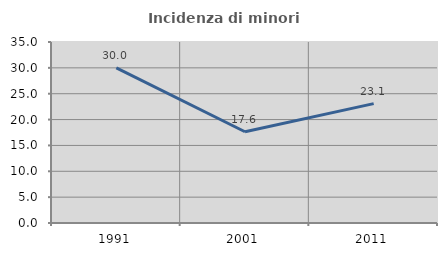
| Category | Incidenza di minori stranieri |
|---|---|
| 1991.0 | 30 |
| 2001.0 | 17.647 |
| 2011.0 | 23.077 |